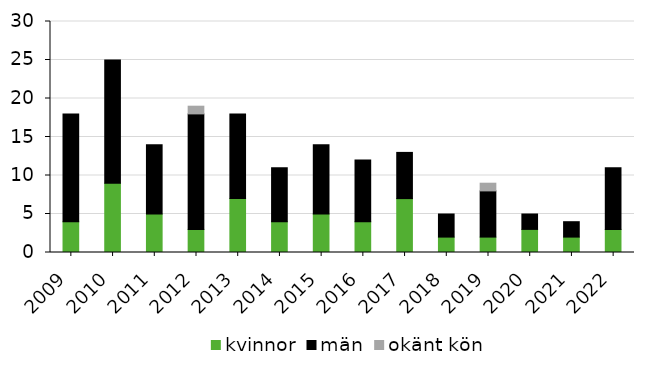
| Category | kvinnor | män | okänt kön |
|---|---|---|---|
| 2009 | 4 | 14 | 0 |
| 2010 | 9 | 16 | 0 |
| 2011 | 5 | 9 | 0 |
| 2012 | 3 | 15 | 1 |
| 2013 | 7 | 11 | 0 |
| 2014 | 4 | 7 | 0 |
| 2015 | 5 | 9 | 0 |
| 2016 | 4 | 8 | 0 |
| 2017 | 7 | 6 | 0 |
| 2018 | 2 | 3 | 0 |
| 2019 | 2 | 6 | 1 |
| 2020 | 3 | 2 | 0 |
| 2021 | 2 | 2 | 0 |
| 2022 | 3 | 8 | 0 |